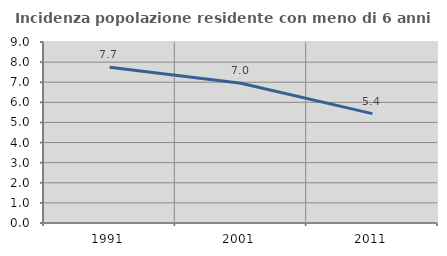
| Category | Incidenza popolazione residente con meno di 6 anni |
|---|---|
| 1991.0 | 7.741 |
| 2001.0 | 6.952 |
| 2011.0 | 5.44 |